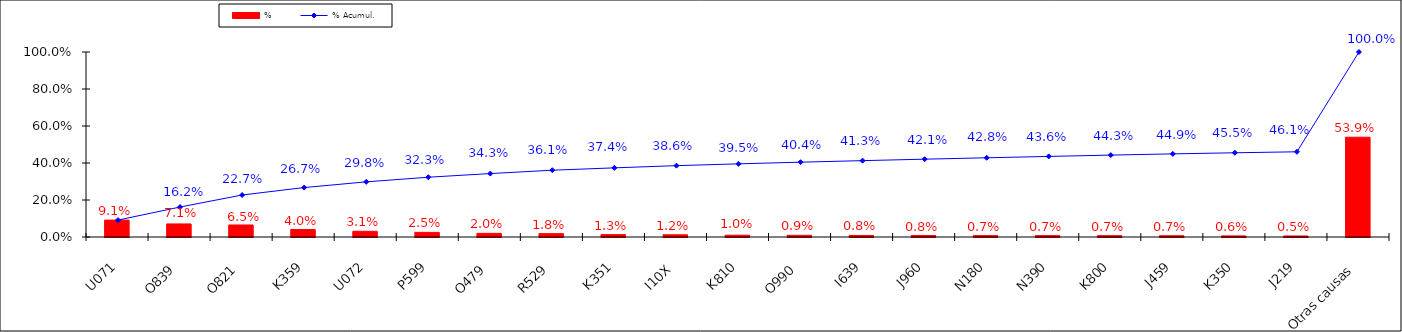
| Category | % |
|---|---|
| U071 | 0.091 |
| O839 | 0.071 |
| O821 | 0.065 |
| K359 | 0.04 |
| U072 | 0.031 |
| P599 | 0.025 |
| O479 | 0.02 |
| R529 | 0.018 |
| K351 | 0.013 |
| I10X | 0.012 |
| K810 | 0.01 |
| O990 | 0.009 |
| I639 | 0.008 |
| J960 | 0.008 |
| N180 | 0.007 |
| N390 | 0.007 |
| K800 | 0.007 |
| J459 | 0.007 |
| K350 | 0.006 |
| J219 | 0.005 |
| Otras causas | 0.539 |